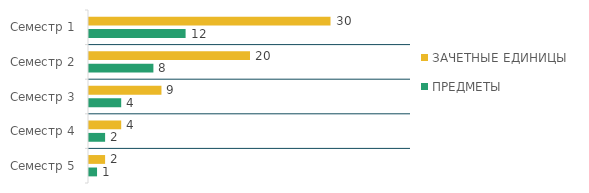
| Category | ЗАЧЕТНЫЕ ЕДИНИЦЫ   | ПРЕДМЕТЫ |
|---|---|---|
| Семестр 1 | 30 | 12 |
| Семестр 2 | 20 | 8 |
| Семестр 3 | 9 | 4 |
| Семестр 4 | 4 | 2 |
| Семестр 5 | 2 | 1 |